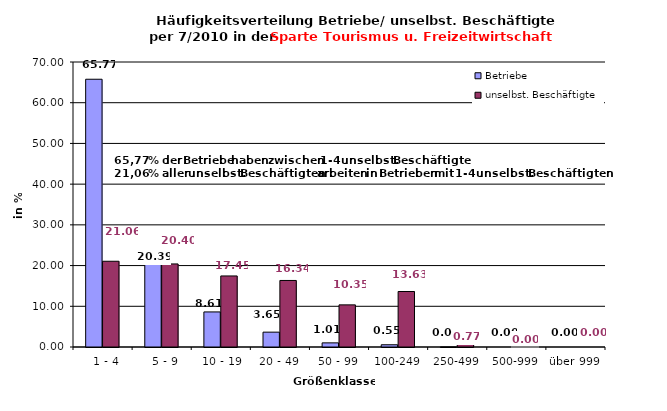
| Category | Betriebe | unselbst. Beschäftigte |
|---|---|---|
|   1 - 4 | 65.765 | 21.058 |
|   5 - 9 | 20.391 | 20.405 |
|  10 - 19 | 8.612 | 17.451 |
| 20 - 49 | 3.648 | 16.344 |
| 50 - 99 | 1.014 | 10.348 |
| 100-249 | 0.552 | 13.628 |
| 250-499 | 0.018 | 0.766 |
| 500-999 | 0 | 0 |
| über 999 | 0 | 0 |